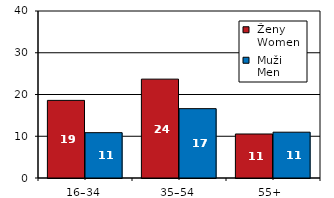
| Category |  Ženy 
 Women |  Muži 
 Men |
|---|---|---|
| 16–34 | 18.59 | 10.86 |
| 35–54 | 23.68 | 16.61 |
| 55+  | 10.54 | 10.97 |